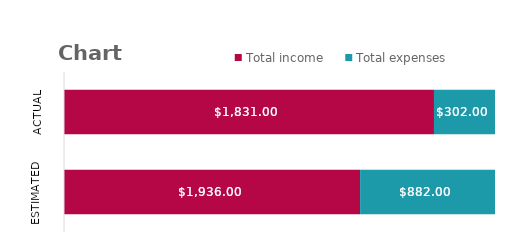
| Category | Total income | Total expenses |
|---|---|---|
| Estimated | 1936 | 882 |
| Actual | 1831 | 302 |